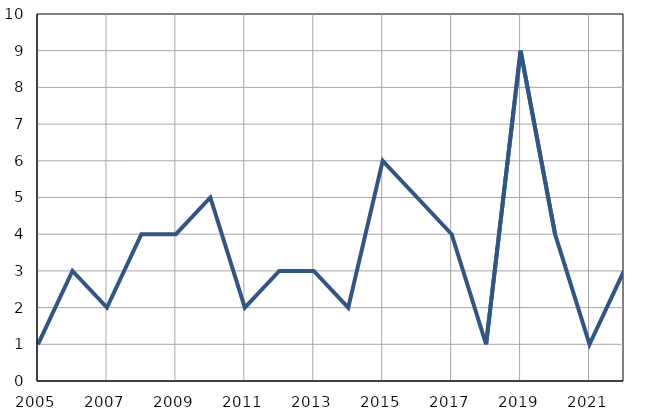
| Category | Infants
deaths |
|---|---|
| 2005.0 | 1 |
| 2006.0 | 3 |
| 2007.0 | 2 |
| 2008.0 | 4 |
| 2009.0 | 4 |
| 2010.0 | 5 |
| 2011.0 | 2 |
| 2012.0 | 3 |
| 2013.0 | 3 |
| 2014.0 | 2 |
| 2015.0 | 6 |
| 2016.0 | 5 |
| 2017.0 | 4 |
| 2018.0 | 1 |
| 2019.0 | 9 |
| 2020.0 | 4 |
| 2021.0 | 1 |
| 2022.0 | 3 |